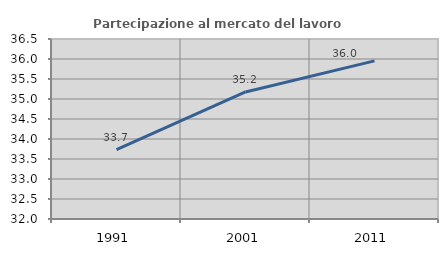
| Category | Partecipazione al mercato del lavoro  femminile |
|---|---|
| 1991.0 | 33.734 |
| 2001.0 | 35.177 |
| 2011.0 | 35.953 |